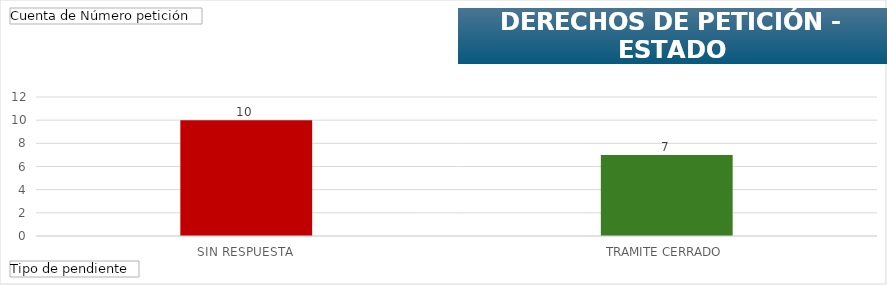
| Category | Total |
|---|---|
| SIN RESPUESTA | 10 |
| TRAMITE CERRADO | 7 |